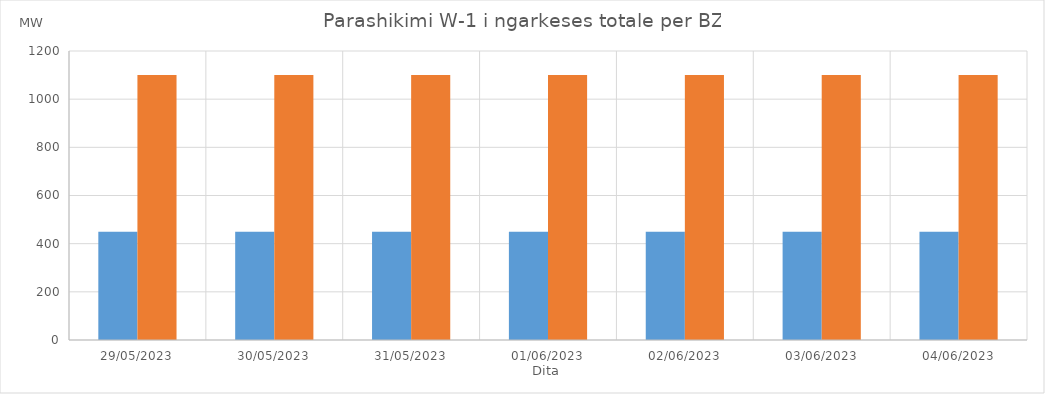
| Category | Min (MW) | Max (MW) |
|---|---|---|
| 29/05/2023 | 450 | 1100 |
| 30/05/2023 | 450 | 1100 |
| 31/05/2023 | 450 | 1100 |
| 01/06/2023 | 450 | 1100 |
| 02/06/2023 | 450 | 1100 |
| 03/06/2023 | 450 | 1100 |
| 04/06/2023 | 450 | 1100 |